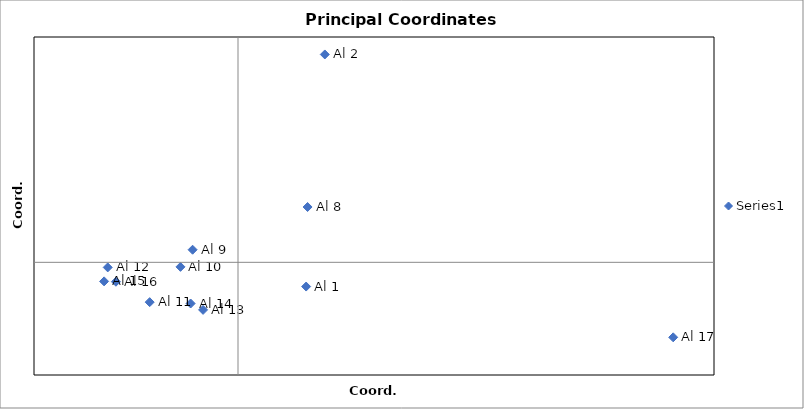
| Category | Series 0 |
|---|---|
| 0.5010660666987112 | -0.322 |
| -0.33379057168915804 | 0.168 |
| -0.25671267887607063 | -0.633 |
| -0.42299860751812796 | -0.06 |
| -0.6494422154701694 | -0.53 |
| -0.9844257522845647 | -0.253 |
| 0.6383198746144597 | 2.768 |
| 3.1999716052405285 | -0.998 |
| 0.5115875277297248 | 0.737 |
| -0.9578424041725455 | -0.068 |
| -0.3482322886108134 | -0.548 |
| -0.8975005556619754 | -0.258 |